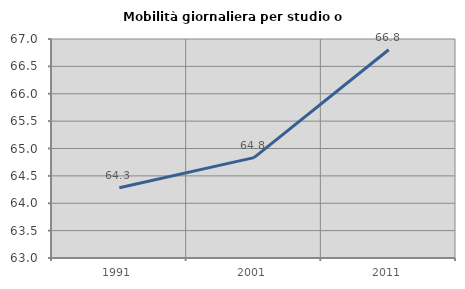
| Category | Mobilità giornaliera per studio o lavoro |
|---|---|
| 1991.0 | 64.282 |
| 2001.0 | 64.833 |
| 2011.0 | 66.804 |